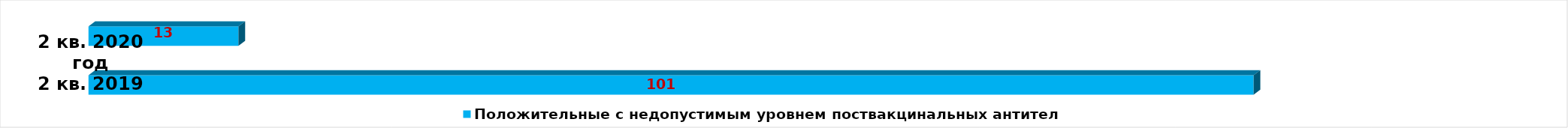
| Category | Положительные с недопустимым уровнем поствакцинальных антител |
|---|---|
| Положительные с недопустимым уровнем поствакцинальных антител | 101 |